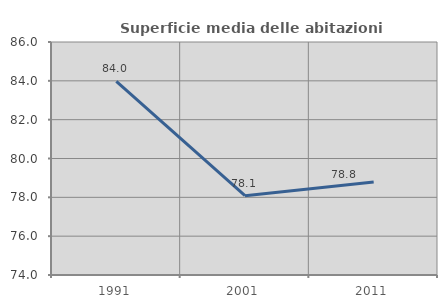
| Category | Superficie media delle abitazioni occupate |
|---|---|
| 1991.0 | 83.973 |
| 2001.0 | 78.085 |
| 2011.0 | 78.787 |